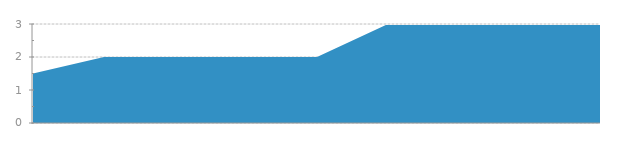
| Category | Series 0 |
|---|---|
| 0 | 1.5 |
| 1 | 2 |
| 2 | 2 |
| 3 | 2 |
| 4 | 2 |
| 5 | 3 |
| 6 | 3 |
| 7 | 3 |
| 8 | 3 |